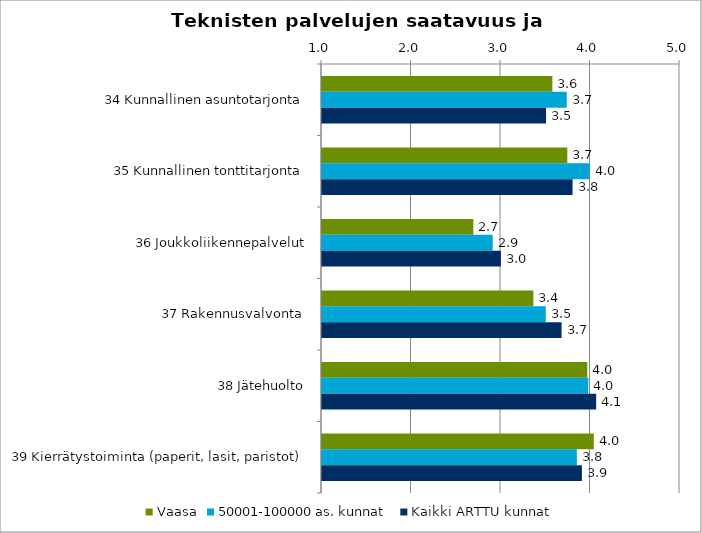
| Category | Vaasa | 50001-100000 as. kunnat | Kaikki ARTTU kunnat |
|---|---|---|---|
| 34 Kunnallinen asuntotarjonta | 3.574 | 3.735 | 3.503 |
| 35 Kunnallinen tonttitarjonta | 3.741 | 3.99 | 3.8 |
| 36 Joukkoliikennepalvelut | 2.691 | 2.908 | 2.999 |
| 37 Rakennusvalvonta | 3.362 | 3.5 | 3.677 |
| 38 Jätehuolto | 3.964 | 3.975 | 4.063 |
| 39 Kierrätystoiminta (paperit, lasit, paristot) | 4.037 | 3.847 | 3.904 |